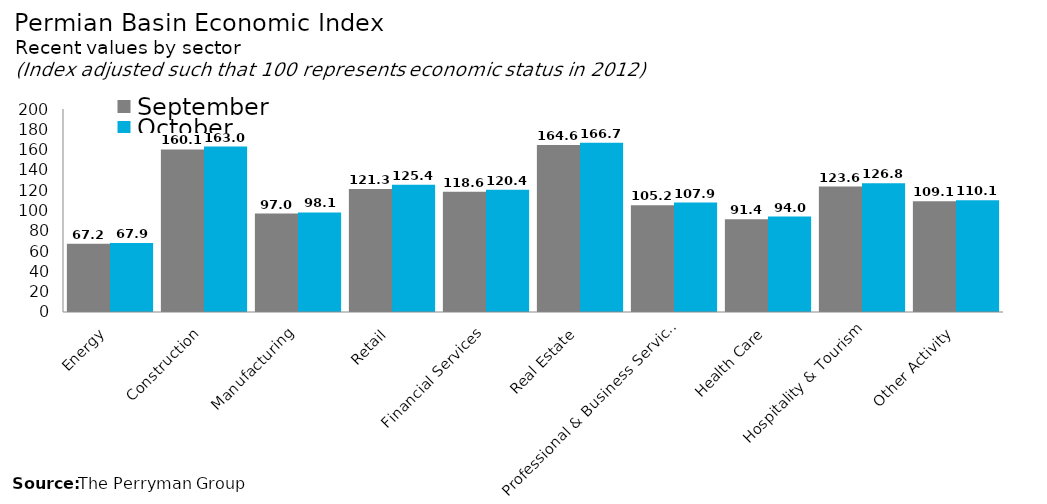
| Category | September | October |
|---|---|---|
| Energy | 67.235 | 67.91 |
| Construction | 160.111 | 162.961 |
| Manufacturing | 97.02 | 98.15 |
| Retail | 121.264 | 125.367 |
| Financial Services | 118.585 | 120.413 |
| Real Estate | 164.58 | 166.652 |
| Professional & Business Services | 105.196 | 107.859 |
| Health Care | 91.422 | 94.014 |
| Hospitality & Tourism | 123.641 | 126.764 |
| Other Activity | 109.086 | 110.113 |